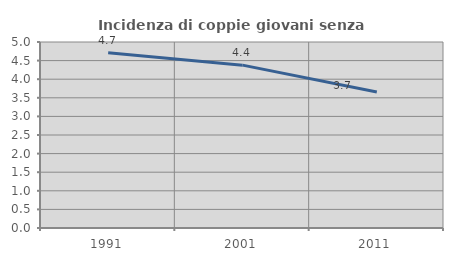
| Category | Incidenza di coppie giovani senza figli |
|---|---|
| 1991.0 | 4.713 |
| 2001.0 | 4.378 |
| 2011.0 | 3.654 |